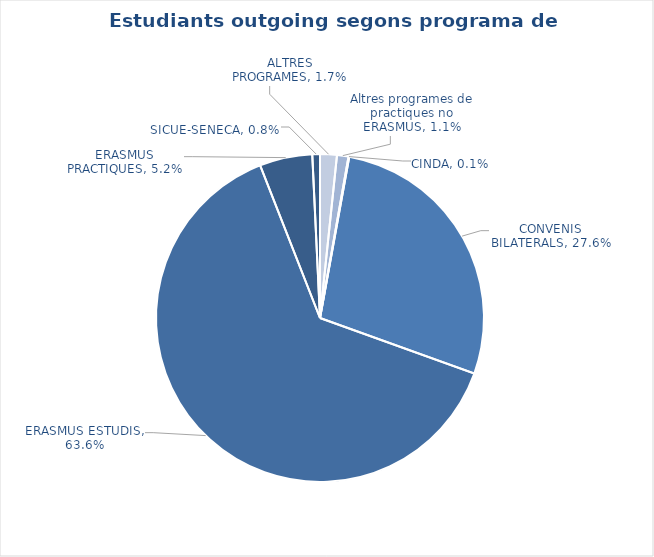
| Category | Estudiants outgoing segons programa de mobilitat |
|---|---|
| ALTRES PROGRAMES | 0.017 |
| Altres programes de practiques no ERASMUS | 0.011 |
| CINDA | 0.001 |
| CONVENIS BILATERALS | 0.276 |
| ERASMUS ESTUDIS | 0.636 |
| ERASMUS PRACTIQUES | 0.052 |
| SICUE-SENECA | 0.008 |